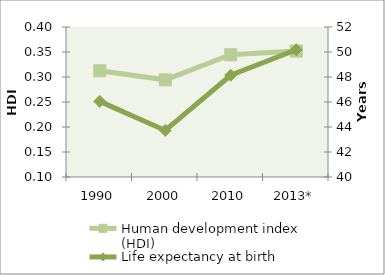
| Category | Human development index (HDI) |
|---|---|
| 1990 | 0.312 |
| 2000 | 0.294 |
| 2010 | 0.344 |
| 2013* | 0.352 |